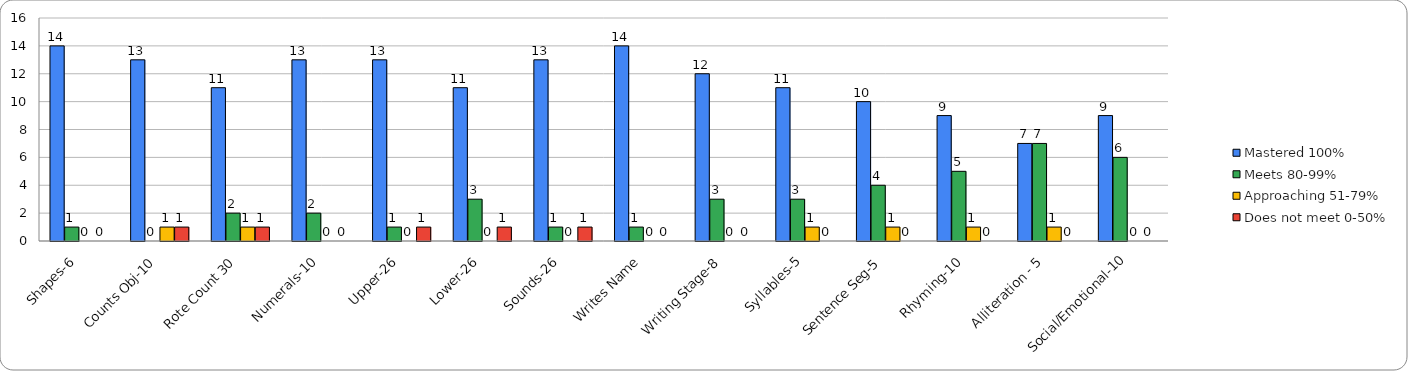
| Category | Mastered 100% | Meets 80-99% | Approaching 51-79% | Does not meet 0-50% |
|---|---|---|---|---|
| Shapes-6 | 14 | 1 | 0 | 0 |
| Counts Obj-10 | 13 | 0 | 1 | 1 |
| Rote Count 30 | 11 | 2 | 1 | 1 |
| Numerals-10 | 13 | 2 | 0 | 0 |
| Upper-26 | 13 | 1 | 0 | 1 |
| Lower-26 | 11 | 3 | 0 | 1 |
| Sounds-26 | 13 | 1 | 0 | 1 |
| Writes Name | 14 | 1 | 0 | 0 |
| Writing Stage-8 | 12 | 3 | 0 | 0 |
| Syllables-5 | 11 | 3 | 1 | 0 |
| Sentence Seg-5 | 10 | 4 | 1 | 0 |
| Rhyming-10 | 9 | 5 | 1 | 0 |
| Alliteration - 5 | 7 | 7 | 1 | 0 |
| Social/Emotional-10 | 9 | 6 | 0 | 0 |